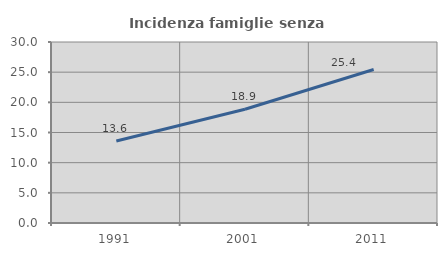
| Category | Incidenza famiglie senza nuclei |
|---|---|
| 1991.0 | 13.589 |
| 2001.0 | 18.85 |
| 2011.0 | 25.45 |